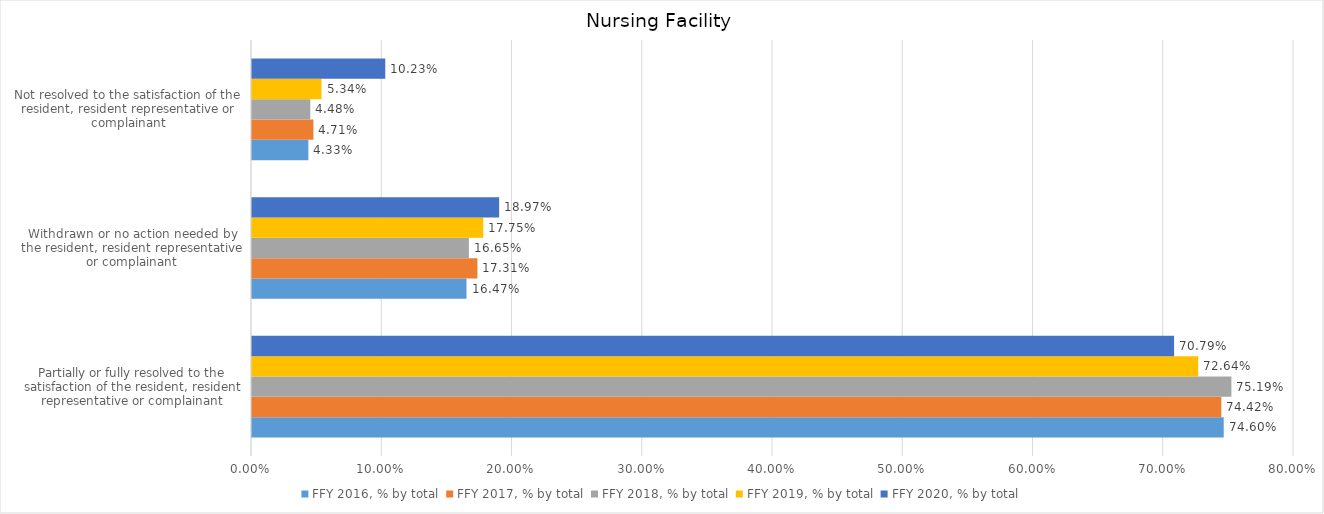
| Category | FFY 2016, % by total | FFY 2017, % by total | FFY 2018, % by total | FFY 2019, % by total | FFY 2020, % by total |
|---|---|---|---|---|---|
| Partially or fully resolved to the satisfaction of the resident, resident representative or complainant | 0.746 | 0.744 | 0.752 | 0.726 | 0.708 |
| Withdrawn or no action needed by the resident, resident representative or complainant | 0.165 | 0.173 | 0.166 | 0.178 | 0.19 |
| Not resolved to the satisfaction of the resident, resident representative or complainant | 0.043 | 0.047 | 0.045 | 0.053 | 0.102 |